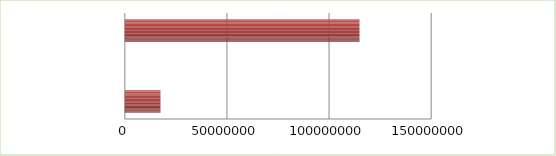
| Category | Series 0 | Series 1 |
|---|---|---|
| 0 | 2.5 | 17448669 |
| 1 | 2.6 | 0 |
| 2 | 2.7 | 114897372 |